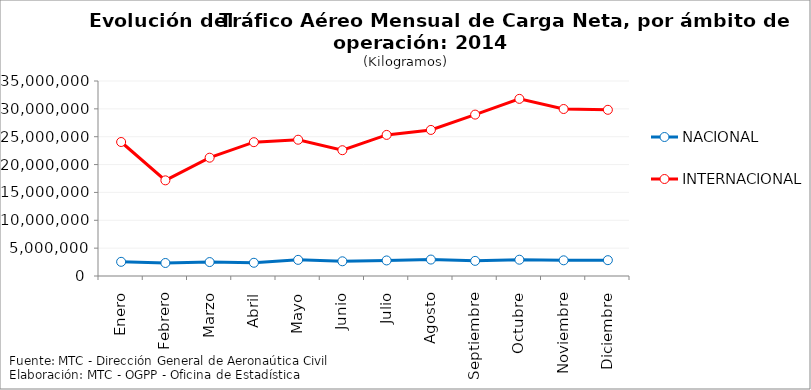
| Category | NACIONAL | INTERNACIONAL |
|---|---|---|
| Enero | 2543518 | 24050564 |
| Febrero | 2335512 | 17166653 |
| Marzo | 2503328 | 21235604 |
| Abril | 2374563 | 24020195 |
| Mayo | 2894742 | 24460903 |
| Junio | 2640678 | 22577298 |
| Julio | 2792123 | 25325186 |
| Agosto | 2952504 | 26216764 |
| Septiembre | 2715098.75 | 28969750 |
| Octubre | 2925831.64 | 31793725 |
| Noviembre | 2815581.96 | 29973694 |
| Diciembre | 2843032.27 | 29830224 |